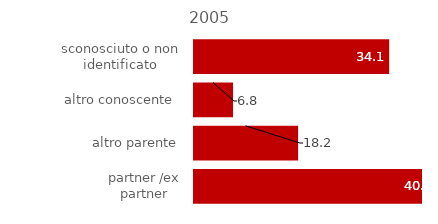
| Category | 2005 |
|---|---|
| partner /ex partner | 40.909 |
| altro parente | 18.182 |
| altro conoscente  | 6.818 |
| sconosciuto o non identificato | 34.091 |